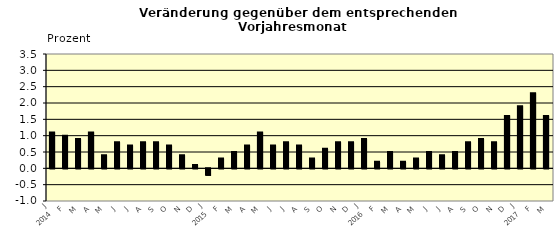
| Category | Series 0 |
|---|---|
| 0 | 1.1 |
| 1 | 1 |
| 2 | 0.9 |
| 3 | 1.1 |
| 4 | 0.4 |
| 5 | 0.8 |
| 6 | 0.7 |
| 7 | 0.8 |
| 8 | 0.8 |
| 9 | 0.7 |
| 10 | 0.4 |
| 11 | 0.1 |
| 12 | -0.2 |
| 13 | 0.3 |
| 14 | 0.5 |
| 15 | 0.7 |
| 16 | 1.1 |
| 17 | 0.7 |
| 18 | 0.8 |
| 19 | 0.7 |
| 20 | 0.3 |
| 21 | 0.6 |
| 22 | 0.8 |
| 23 | 0.8 |
| 24 | 0.9 |
| 25 | 0.2 |
| 26 | 0.5 |
| 27 | 0.2 |
| 28 | 0.3 |
| 29 | 0.5 |
| 30 | 0.4 |
| 31 | 0.5 |
| 32 | 0.8 |
| 33 | 0.9 |
| 34 | 0.8 |
| 35 | 1.6 |
| 36 | 1.9 |
| 37 | 2.3 |
| 38 | 1.6 |